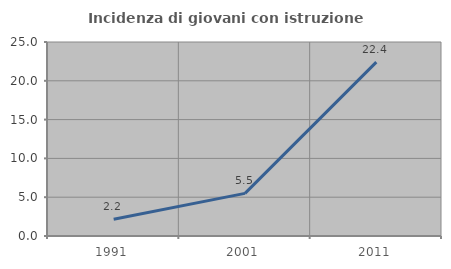
| Category | Incidenza di giovani con istruzione universitaria |
|---|---|
| 1991.0 | 2.151 |
| 2001.0 | 5.495 |
| 2011.0 | 22.414 |